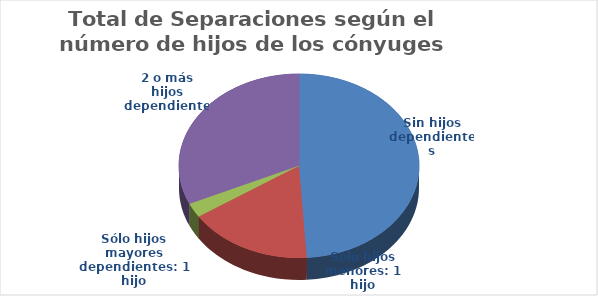
| Category | Series 0 |
|---|---|
| Sin hijos dependientes | 1572 |
| Sólo hijos menores: 1 hijo | 537 |
| Sólo hijos mayores dependientes: 1 hijo | 81 |
| 2 o más hijos dependientes | 1020 |